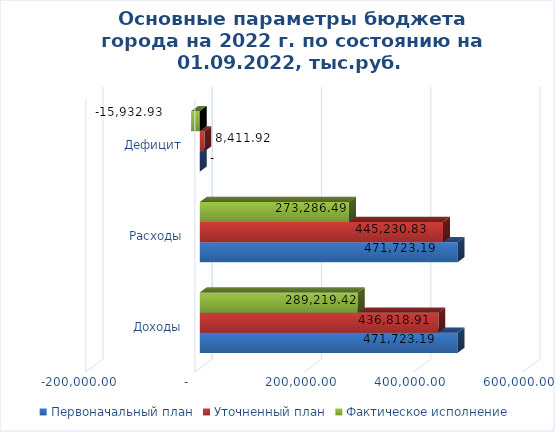
| Category | Первоначальный план | Уточненный план | Фактическое исполнение |
|---|---|---|---|
| Доходы | 471723.19 | 436818.91 | 289219.42 |
| Расходы | 471723.19 | 445230.83 | 273286.49 |
| Дефицит | 0 | 8411.92 | -15932.93 |